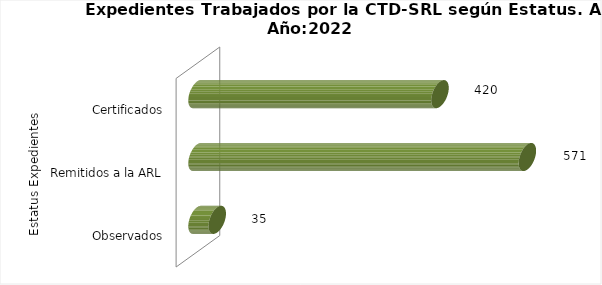
| Category | Total |
|---|---|
| 0 | 35 |
| 1 | 571 |
| 2 | 420 |